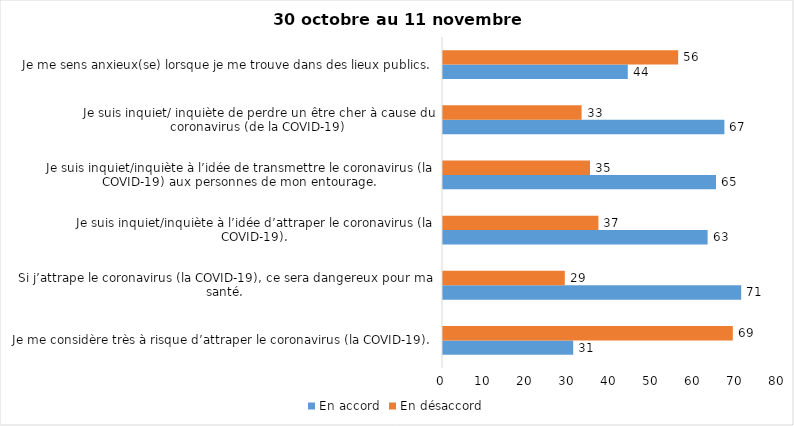
| Category | En accord | En désaccord |
|---|---|---|
| Je me considère très à risque d’attraper le coronavirus (la COVID-19). | 31 | 69 |
| Si j’attrape le coronavirus (la COVID-19), ce sera dangereux pour ma santé. | 71 | 29 |
| Je suis inquiet/inquiète à l’idée d’attraper le coronavirus (la COVID-19). | 63 | 37 |
| Je suis inquiet/inquiète à l’idée de transmettre le coronavirus (la COVID-19) aux personnes de mon entourage. | 65 | 35 |
| Je suis inquiet/ inquiète de perdre un être cher à cause du coronavirus (de la COVID-19) | 67 | 33 |
| Je me sens anxieux(se) lorsque je me trouve dans des lieux publics. | 44 | 56 |